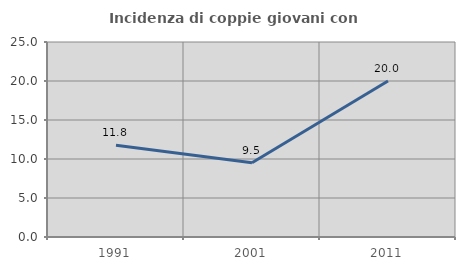
| Category | Incidenza di coppie giovani con figli |
|---|---|
| 1991.0 | 11.765 |
| 2001.0 | 9.524 |
| 2011.0 | 20 |